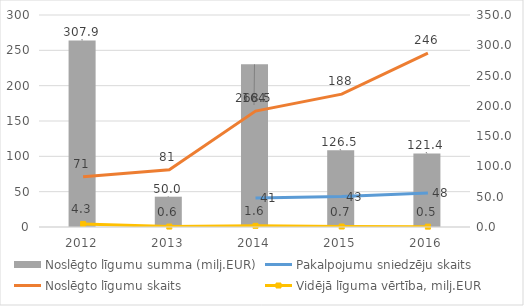
| Category | Noslēgto līgumu summa (milj.EUR) |
|---|---|
| 2012.0 | 307.912 |
| 2013.0 | 50.012 |
| 2014.0 | 268.503 |
| 2015.0 | 126.516 |
| 2016.0 | 121.4 |